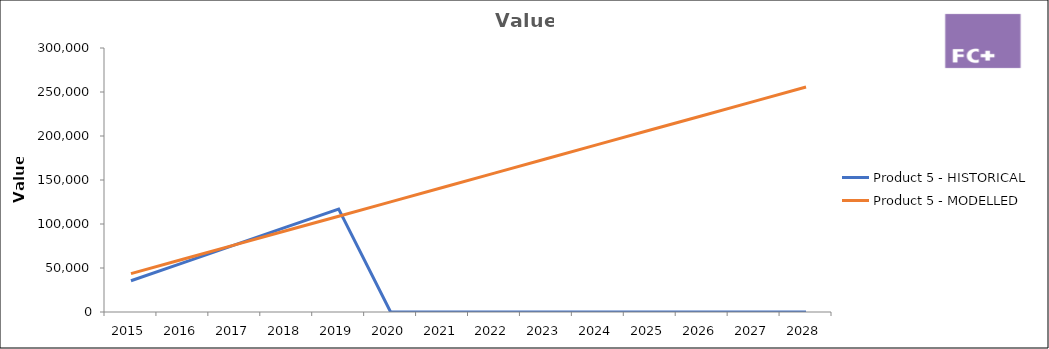
| Category | Product 5 - HISTORICAL | Product 5 - MODELLED |
|---|---|---|
| 2015.0 | 35485 | 43640.6 |
| 2016.0 | 55874 | 59951.8 |
| 2017.0 | 76263 | 76263 |
| 2018.0 | 96652 | 92574.2 |
| 2019.0 | 117041 | 108885.4 |
| 2020.0 | 0 | 125196.6 |
| 2021.0 | 0 | 141507.8 |
| 2022.0 | 0 | 157819 |
| 2023.0 | 0 | 174130.2 |
| 2024.0 | 0 | 190441.4 |
| 2025.0 | 0 | 206752.6 |
| 2026.0 | 0 | 223063.8 |
| 2027.0 | 0 | 239375 |
| 2028.0 | 0 | 255686.2 |